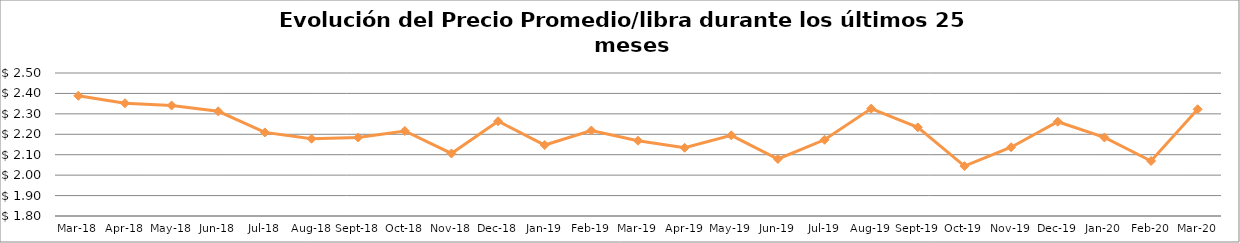
| Category | Series 0 |
|---|---|
| 2018-03-01 | 2.388 |
| 2018-04-01 | 2.352 |
| 2018-05-01 | 2.341 |
| 2018-06-01 | 2.312 |
| 2018-07-01 | 2.209 |
| 2018-08-01 | 2.178 |
| 2018-09-01 | 2.184 |
| 2018-10-01 | 2.216 |
| 2018-11-01 | 2.106 |
| 2018-12-01 | 2.264 |
| 2019-01-01 | 2.147 |
| 2019-02-01 | 2.218 |
| 2019-03-01 | 2.169 |
| 2019-04-01 | 2.134 |
| 2019-05-01 | 2.195 |
| 2019-06-01 | 2.079 |
| 2019-07-01 | 2.173 |
| 2019-08-01 | 2.326 |
| 2019-09-01 | 2.234 |
| 2019-10-01 | 2.044 |
| 2019-11-01 | 2.137 |
| 2019-12-01 | 2.262 |
| 2020-01-01 | 2.185 |
| 2020-02-01 | 2.069 |
| 2020-03-01 | 2.323 |